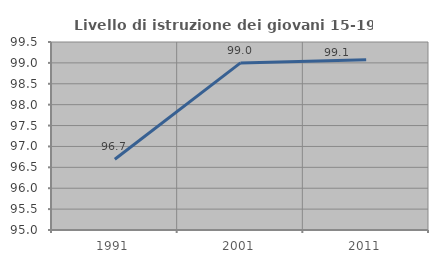
| Category | Livello di istruzione dei giovani 15-19 anni |
|---|---|
| 1991.0 | 96.694 |
| 2001.0 | 99 |
| 2011.0 | 99.074 |